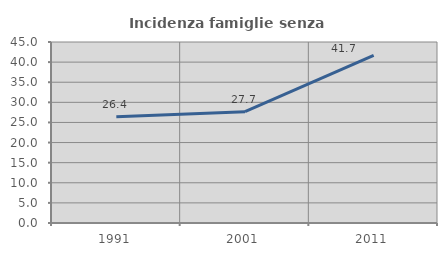
| Category | Incidenza famiglie senza nuclei |
|---|---|
| 1991.0 | 26.407 |
| 2001.0 | 27.679 |
| 2011.0 | 41.7 |